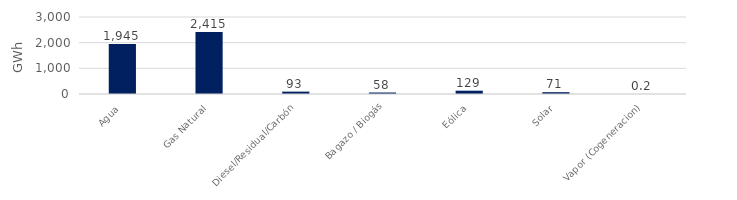
| Category | Series 0 |
|---|---|
| Agua | 1945.108 |
| Gas Natural | 2414.595 |
| Diesel/Residual/Carbón | 92.56 |
| Bagazo / Biogás | 58.09 |
| Eólica | 128.811 |
| Solar | 70.789 |
| Vapor (Cogeneracion) | 0.189 |